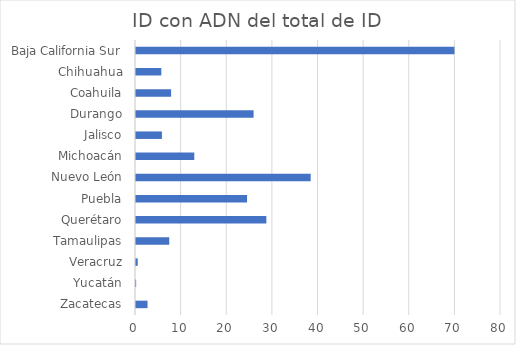
| Category | ID con ADN del total de ID |
|---|---|
| Zacatecas | 2.525 |
| Yucatán | 0.031 |
| Veracruz | 0.383 |
| Tamaulipas | 7.282 |
| Querétaro | 28.571 |
| Puebla | 24.338 |
| Nuevo León | 38.286 |
| Michoacán | 12.776 |
| Jalisco | 5.682 |
| Durango | 25.777 |
| Coahuila | 7.692 |
| Chihuahua | 5.547 |
| Baja California Sur | 69.792 |